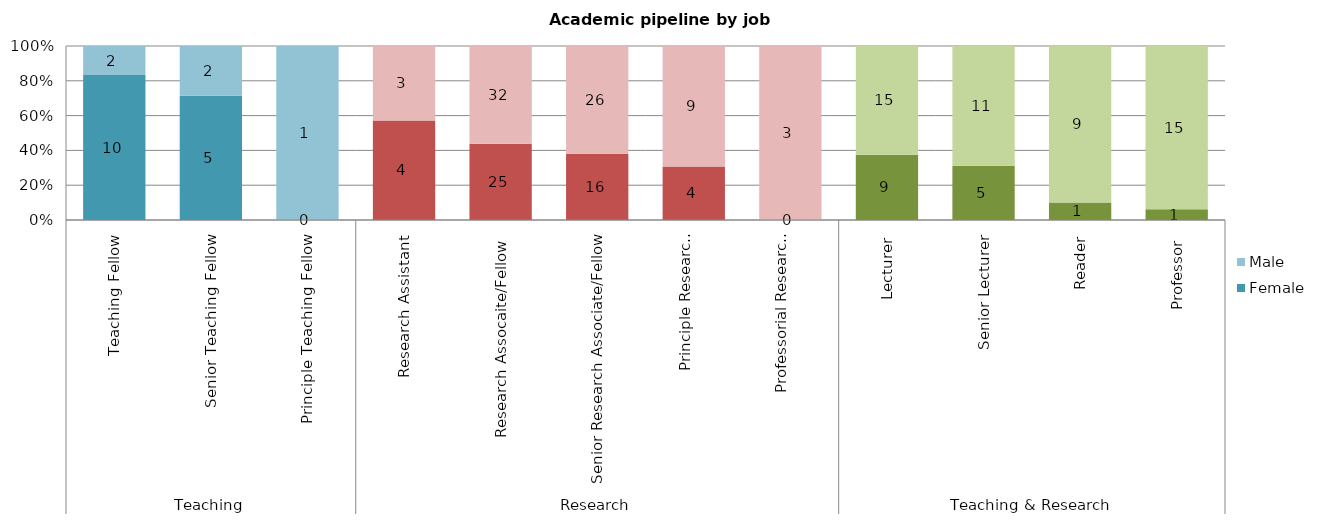
| Category | Female | Male |
|---|---|---|
| 0 | 10 | 2 |
| 1 | 5 | 2 |
| 2 | 0 | 1 |
| 3 | 4 | 3 |
| 4 | 25 | 32 |
| 5 | 16 | 26 |
| 6 | 4 | 9 |
| 7 | 0 | 3 |
| 8 | 9 | 15 |
| 9 | 5 | 11 |
| 10 | 1 | 9 |
| 11 | 1 | 15 |